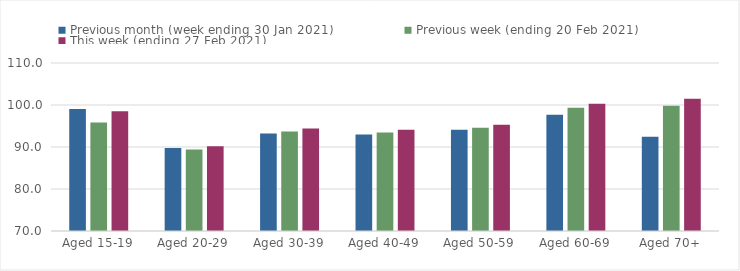
| Category | Previous month (week ending 30 Jan 2021) | Previous week (ending 20 Feb 2021) | This week (ending 27 Feb 2021) |
|---|---|---|---|
| Aged 15-19 | 99.06 | 95.83 | 98.53 |
| Aged 20-29 | 89.75 | 89.41 | 90.19 |
| Aged 30-39 | 93.22 | 93.72 | 94.41 |
| Aged 40-49 | 92.98 | 93.45 | 94.1 |
| Aged 50-59 | 94.09 | 94.56 | 95.31 |
| Aged 60-69 | 97.65 | 99.34 | 100.27 |
| Aged 70+ | 92.44 | 99.85 | 101.51 |